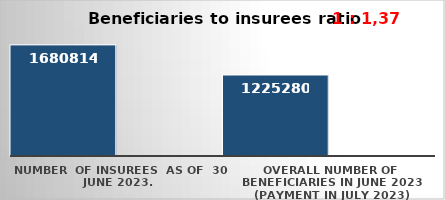
| Category | Series 0 | Series 1 |
|---|---|---|
| NUMBER  of insurees  as of  30 June 2023. | 1680814 |  |
| OVERALL number of beneficiaries in June 2023 (payment in July 2023) | 1225280 |  |